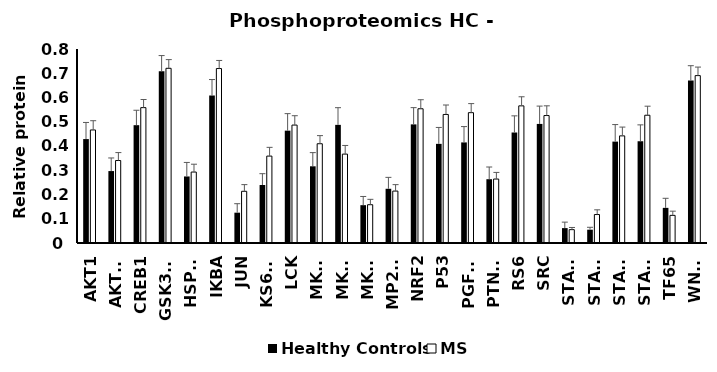
| Category | Healthy Controls | MS  |
|---|---|---|
| AKT1 | 0.429 | 0.466 |
| AKTS1 | 0.297 | 0.34 |
| CREB1 | 0.486 | 0.558 |
| GSK3AB | 0.708 | 0.72 |
| HSPB1 | 0.274 | 0.293 |
| IKBA | 0.608 | 0.719 |
| JUN | 0.125 | 0.213 |
| KS6B1 | 0.239 | 0.358 |
| LCK | 0.463 | 0.486 |
| MK03 | 0.316 | 0.409 |
| MK09 | 0.487 | 0.367 |
| MK12 | 0.156 | 0.158 |
| MP2K1 | 0.224 | 0.214 |
| NRF2 | 0.489 | 0.554 |
| P53 | 0.409 | 0.53 |
| PGFRB | 0.415 | 0.537 |
| PTN11 | 0.263 | 0.264 |
| RS6 | 0.456 | 0.566 |
| SRC | 0.491 | 0.526 |
| STAT1 | 0.061 | 0.055 |
| STAT3 | 0.055 | 0.117 |
| STAT5 | 0.418 | 0.442 |
| STAT6 | 0.42 | 0.527 |
| TF65 | 0.145 | 0.114 |
| WNK1 | 0.67 | 0.69 |